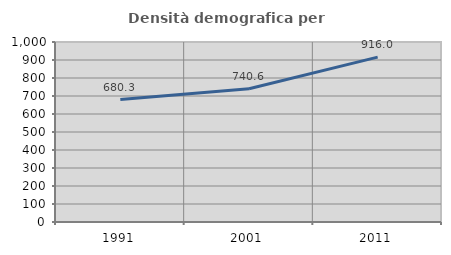
| Category | Densità demografica |
|---|---|
| 1991.0 | 680.268 |
| 2001.0 | 740.553 |
| 2011.0 | 916.014 |